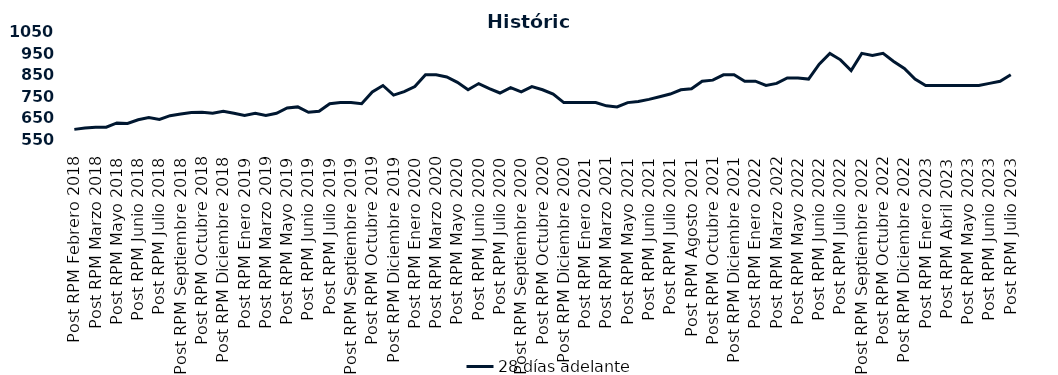
| Category | 28 días adelante |
|---|---|
| Post RPM Febrero 2018 | 595 |
| Pre RPM Marzo 2018 | 601 |
| Post RPM Marzo 2018 | 605 |
| Pre RPM Mayo 2018 | 605 |
| Post RPM Mayo 2018 | 625 |
| Pre RPM Junio 2018 | 623 |
| Post RPM Junio 2018 | 640 |
| Pre RPM Julio 2018 | 650 |
| Post RPM Julio 2018 | 641 |
| Pre RPM Septiembre 2018 | 659 |
| Post RPM Septiembre 2018 | 666.75 |
| Pre RPM Octubre 2018 | 674 |
| Post RPM Octubre 2018 | 675 |
| Pre RPM Diciembre 2018 | 670 |
| Post RPM Diciembre 2018 | 680 |
| Pre RPM Enero 2019 | 670 |
| Post RPM Enero 2019 | 660 |
| Pre RPM Marzo 2019 | 670 |
| Post RPM Marzo 2019 | 660 |
| Pre RPM Mayo 2019 | 670 |
| Post RPM Mayo 2019 | 695 |
| Pre RPM Junio 2019 | 700 |
| Post RPM Junio 2019 | 675 |
| Pre RPM Julio 2019 | 680 |
| Post RPM Julio 2019 | 715 |
| Pre RPM Septiembre 2019 | 720 |
| Post RPM Septiembre 2019 | 720 |
| Pre RPM Octubre 2019 | 715 |
| Post RPM Octubre 2019 | 770 |
| Pre RPM Diciembre 2019 | 800 |
| Post RPM Diciembre 2019 | 755 |
| Pre RPM Enero 2020 | 771 |
| Post RPM Enero 2020 | 795 |
| Pre RPM Marzo 2020 | 850 |
| Post RPM Marzo 2020 | 850 |
| Pre RPM Mayo 2020 | 840 |
| Post RPM Mayo 2020 | 815 |
| Pre RPM Junio 2020 | 780 |
| Post RPM Junio 2020 | 809 |
| Pre RPM Julio 2020 | 785.72 |
| Post RPM Julio 2020 | 765 |
| Pre RPM Septiembre 2020 | 790 |
| Post RPM Septiembre 2020 | 770 |
| Pre RPM Octubre 2020 | 795 |
| Post RPM Octubre 2020 | 780 |
| Pre RPM Diciembre 2020 | 760 |
| Post RPM Diciembre 2020 | 720 |
| Pre RPM Enero 2021 | 720 |
| Post RPM Enero 2021 | 720 |
| Pre RPM Marzo 2021 | 720 |
| Post RPM Marzo 2021 | 705 |
| Pre RPM Mayo 2021 | 700 |
| Post RPM Mayo 2021 | 720 |
| Pre RPM Junio 2021 | 725 |
| Post RPM Junio 2021 | 735 |
| Pre RPM Julio 2021 | 747.5 |
| Post RPM Julio 2021 | 760 |
| Pre RPM Agosto 2021 | 780 |
| Post RPM Agosto 2021 | 785 |
| Pre RPM Octubre 2021 | 820 |
| Post RPM Octubre 2021 | 825 |
| Pre RPM Diciembre 2021 | 850 |
| Post RPM Diciembre 2021 | 850 |
| Pre RPM Enero 2022 | 820 |
| Post RPM Enero 2022 | 820 |
| Pre RPM Marzo 2022 | 800 |
| Post RPM Marzo 2022 | 810 |
| Pre RPM Mayo 2022 | 835 |
| Post RPM Mayo 2022 | 835 |
| Pre RPM Junio 2022 | 830 |
| Post RPM Junio 2022 | 900 |
| Pre RPM Julio 2022 | 950 |
| Post RPM Julio 2022 | 920 |
| Pre RPM Septiembre 2022 | 870 |
| Post RPM Septiembre 2022 | 950 |
| Pre RPM Octubre 2022 | 940 |
| Post RPM Octubre 2022 | 950 |
| Pre RPM Diciembre 2022 | 912.5 |
| Post RPM Diciembre 2022 | 880 |
| Pre RPM Enero 2023 | 830 |
| Post RPM Enero 2023 | 800 |
| Pre RPM Abril 2023 | 800 |
| Post RPM Abril 2023 | 800 |
| Pre RPM Mayo 2023 | 800 |
| Post RPM Mayo 2023 | 800 |
| Pre RPM Junio 2023 | 800 |
| Post RPM Junio 2023 | 810 |
| Pre RPM Julio 2023 | 820 |
| Post RPM Julio 2023 | 850 |